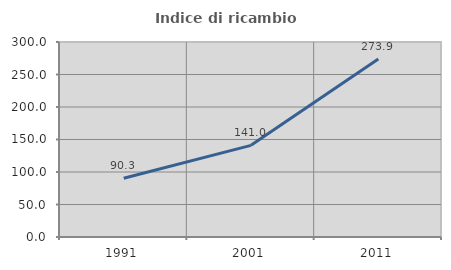
| Category | Indice di ricambio occupazionale  |
|---|---|
| 1991.0 | 90.281 |
| 2001.0 | 141.017 |
| 2011.0 | 273.853 |